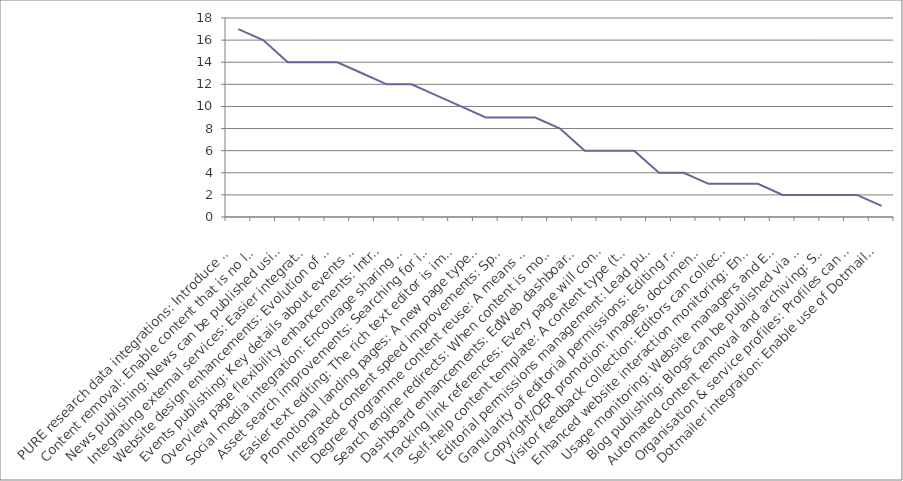
| Category | Series 0 |
|---|---|
| PURE research data integrations: Introduce more opportunities to present information from the Edinburgh Research Explorer in EdWeb-managed web pages, with no technical knowledge needed. (Currently only publication lists possible). | 17 |
| Content removal: Enable content that is no longer required or created in error to be removable, reducing unnecessary clutter in the EdWeb content tree for editors. | 16 |
| News publishing: News can be published using a dedicated content type (template); enhancing presentation on different device sizes, allowing more intelligent sharing and promotion in search results. | 14 |
| Integrating external services: Easier integration of services such as Google Maps, You Tube videos, Twitter feeds. Simple URL pasting into EdWeb with no need for interaction with HTML or assets. | 14 |
| Website design enhancements: Evolution of design to improve website visitor experience on small devices, bringing greater focus to content over brand & navigation elements and promoting clearer/easier interactions. | 14 |
| Events publishing: Key details about events can be displayed differently in different contexts, such as the automatic creation of an events calendar. | 13 |
| Overview page flexibility enhancements: Introduce new layout options to enable overview pages to dynamically present the content below in a range of ways. | 12 |
| Social media integration: Encourage sharing of website content via social media buttons, and features to monitor engagement on popular networks. | 12 |
| Asset search improvements: Searching for images, documents, videos, content snippets etc is quicker, easier and more efficient. | 11 |
| Easier text editing: The rich text editor is improved, so that it's quicker and easier to make changes to content, to apply stand-out formatting elements and to ensure everything is standards compliant. | 10 |
| Promotional landing pages: A new page type designed for promotional impact and flexibility, which can be used at any point in a site structure. It will work much like a Generic Content page, but have presentational features similar to a homepage. | 9 |
| Integrated content speed improvements: Speed up page load times for content being delivered from external systems through EdWeb. | 9 |
| Degree programme content reuse: A means to re-use and extend golden copy content about degree programmes, that is currently published only via the Degree Finder | 9 |
| Search engine redirects: When content is moved or removed, enable 301 redirects. This reduces the risk of a website visitor receiving a 'Page not found' error from a search result in the period before the site is re-indexed. | 8 |
| Dashboard enhancements: EdWeb dashboard is more useful to editors and publishers, speeding up completion of the most common tasks, and can be configured to suit an individual's priorities. | 6 |
| Tracking link references: Every page will contain a list of all other EdWeb pages that link to it, so that when it is edited, moved or removed the editor is aware of the impact of their actions on other publishers across the University. | 6 |
| Self-help content template: A content type (template) optimised for presentation of online help and guidance, supporting user self service. | 6 |
| Editorial permissions management: Lead publishers can assign editorial rights on their website to any trained user, without involving EdWeb support. | 4 |
| Granularity of editorial permissions: Editing rights can be restricted to particular subsections or content types, rather than having access to everything in a particular site. | 4 |
| Copyright/OER promotion: Images, documents and other assets can be promoted as Open Educational Resources, encouraging reuse of University materials worldwide. | 3 |
| Visitor feedback collection: Editors can collect and view visitor ratings for page content, to identify strengths and quickly correct any errors. | 3 |
| Enhanced website interaction monitoring: Enable use of analytics tools (click heat tracking, A/B testing etc) that provide additional insight into how website visitors are interacting with the website. This informs ongoing content & design improvements. | 3 |
| Usage monitoring: Website managers and EdWeb support services have access to data on editorial and publishing activity, which will support better website management, staffing and user support-related decision making. | 2 |
| Blog publishing: Blogs can be published via EdWeb, with sufficient design changes to distinguish from corporate web content, and new navigation and filtering options typically associated with this kind of content (sort by author, by date, by tag etc). | 2 |
| Automated content removal and archiving: Schedule archiving and permanent removal of unpublished content after given periods to reduce unnecessary clutter and support compliance with records management legislation. | 2 |
| Organisation & service profiles: Profiles can be published using a dedicated content type (template); enhancing presentation on different device sizes, allowing more intelligent sharing and promotion in search results. | 2 |
| Dotmailer integration: Enable use of Dotmailer through EdWeb as a means to build and manage mailing lists more efficiently. | 1 |